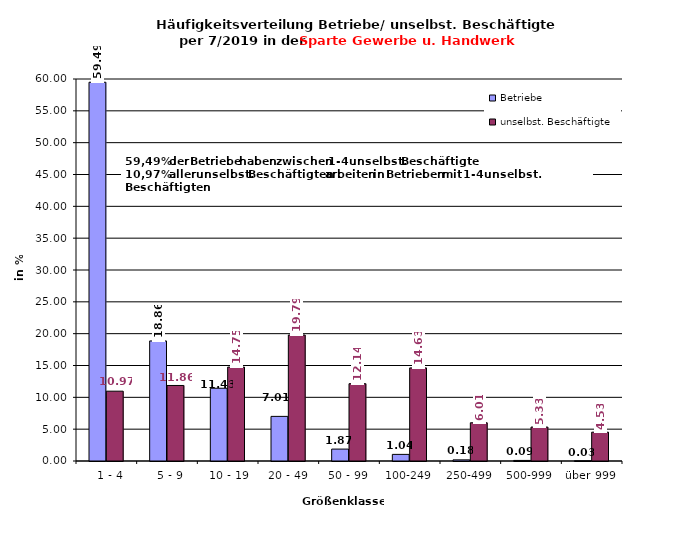
| Category | Betriebe | unselbst. Beschäftigte |
|---|---|---|
|   1 - 4 | 59.491 | 10.966 |
|   5 - 9 | 18.858 | 11.863 |
|  10 - 19 | 11.428 | 14.751 |
| 20 - 49 | 7.007 | 19.788 |
| 50 - 99 | 1.871 | 12.143 |
| 100-249 | 1.04 | 14.625 |
| 250-499 | 0.18 | 6.007 |
| 500-999 | 0.09 | 5.331 |
| über 999 | 0.035 | 4.526 |